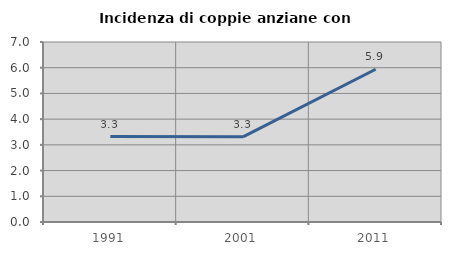
| Category | Incidenza di coppie anziane con figli |
|---|---|
| 1991.0 | 3.323 |
| 2001.0 | 3.313 |
| 2011.0 | 5.941 |